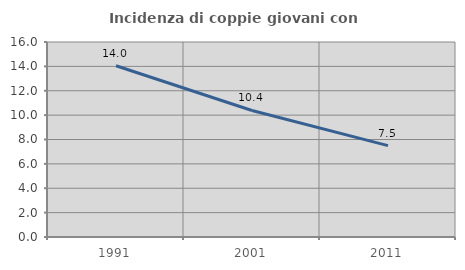
| Category | Incidenza di coppie giovani con figli |
|---|---|
| 1991.0 | 14.049 |
| 2001.0 | 10.38 |
| 2011.0 | 7.497 |